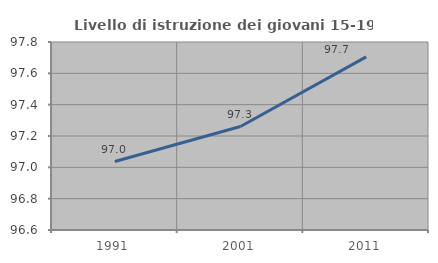
| Category | Livello di istruzione dei giovani 15-19 anni |
|---|---|
| 1991.0 | 97.037 |
| 2001.0 | 97.26 |
| 2011.0 | 97.705 |